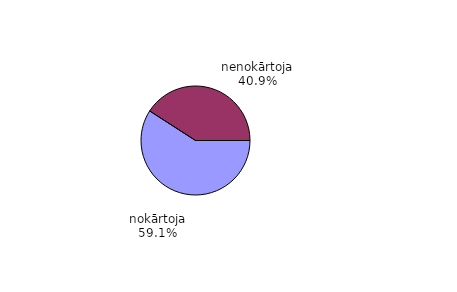
| Category | Series 0 |
|---|---|
| nokārtoja | 0.591 |
| nenokārtoja | 0.409 |